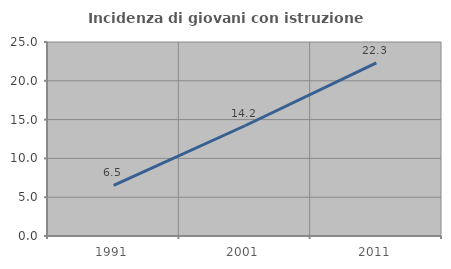
| Category | Incidenza di giovani con istruzione universitaria |
|---|---|
| 1991.0 | 6.509 |
| 2001.0 | 14.207 |
| 2011.0 | 22.302 |